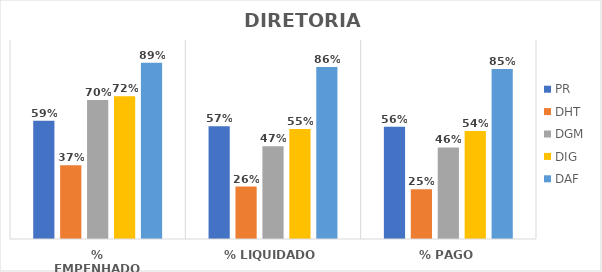
| Category | PR | DHT | DGM | DIG | DAF |
|---|---|---|---|---|---|
| % EMPENHADO | 0.595 | 0.371 | 0.699 | 0.717 | 0.885 |
| % LIQUIDADO | 0.567 | 0.264 | 0.466 | 0.552 | 0.864 |
| % PAGO | 0.564 | 0.25 | 0.46 | 0.542 | 0.854 |